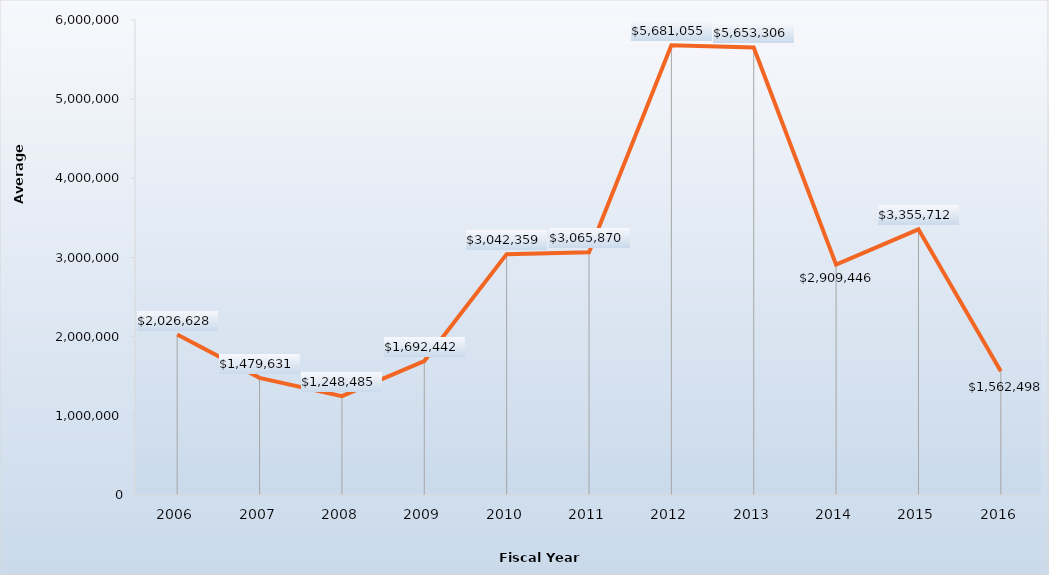
| Category | Mean |
|---|---|
| 2006.0 | 2026628 |
| 2007.0 | 1479631 |
| 2008.0 | 1248485 |
| 2009.0 | 1692442 |
| 2010.0 | 3042359 |
| 2011.0 | 3065870 |
| 2012.0 | 5681055 |
| 2013.0 | 5653306 |
| 2014.0 | 2909446 |
| 2015.0 | 3355712 |
| 2016.0 | 1562498 |